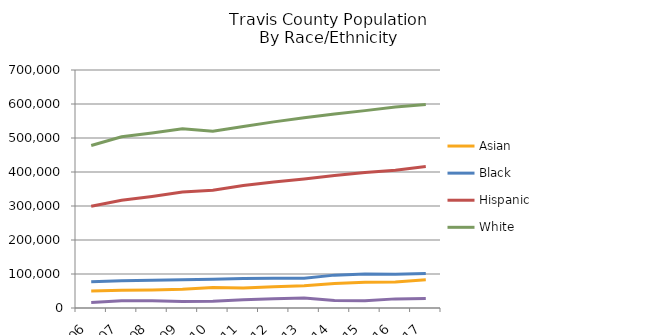
| Category | Asian | Black | Hispanic | White | Other Race or 2 or More Races |
|---|---|---|---|---|---|
| 2006.0 | 50151 | 77403 | 299239 | 478087 | 16126 |
| 2007.0 | 52105 | 80311 | 316643 | 503830 | 21476 |
| 2008.0 | 53229 | 81276 | 328217 | 514703 | 21118 |
| 2009.0 | 55078 | 82860 | 341435 | 527528 | 19257 |
| 2010.0 | 60491 | 84303 | 346529 | 519591 | 19892 |
| 2011.0 | 58583 | 86727 | 360086 | 533671 | 24063 |
| 2012.0 | 62387 | 87744 | 370741 | 547393 | 27319 |
| 2013.0 | 65405 | 87387 | 379331 | 559293 | 29538 |
| 2014.0 | 71971 | 96683 | 389834 | 570544 | 22113 |
| 2015.0 | 75784 | 100301 | 398770 | 580542 | 21161 |
| 2016.0 | 76749 | 99449 | 405447 | 590845 | 26833 |
| 2017.0 | 82866 | 101281 | 416156 | 598703 | 27692 |